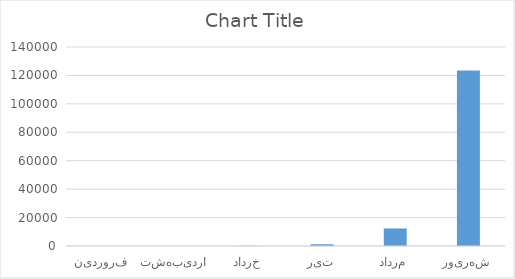
| Category | Series 0 |
|---|---|
| فروردین | 1 |
| اردیبهشت | 12 |
| خرداد | 123 |
| تیر | 1234 |
| مرداد | 12345 |
| شهریور | 123456 |